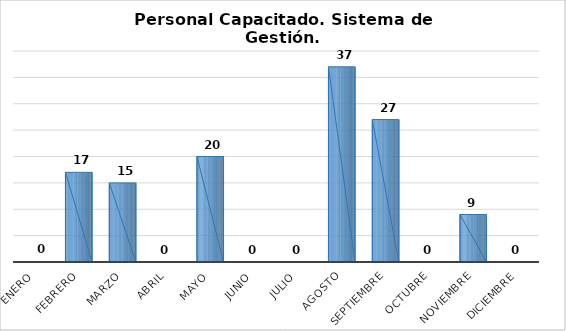
| Category | Personal capacitado/2 |
|---|---|
| Enero | 0 |
| Febrero | 17 |
| Marzo | 15 |
| Abril | 0 |
| Mayo | 20 |
| Junio | 0 |
| Julio | 0 |
| Agosto | 37 |
| Septiembre | 27 |
| Octubre | 0 |
| Noviembre | 9 |
| Diciembre | 0 |